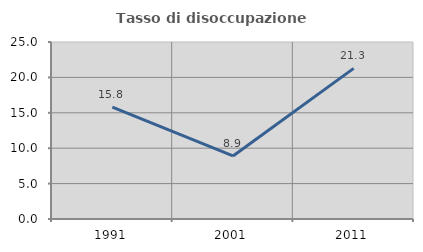
| Category | Tasso di disoccupazione giovanile  |
|---|---|
| 1991.0 | 15.814 |
| 2001.0 | 8.904 |
| 2011.0 | 21.277 |